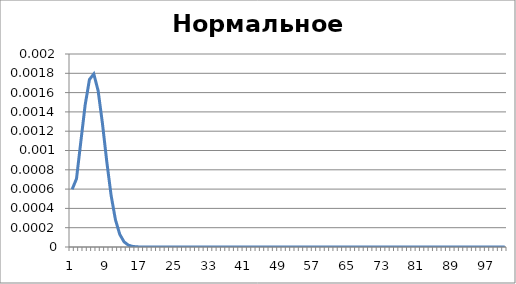
| Category | Нормальное распределение |
|---|---|
| 0 | 0.001 |
| 1 | 0.001 |
| 2 | 0.001 |
| 3 | 0.001 |
| 4 | 0.002 |
| 5 | 0.002 |
| 6 | 0.002 |
| 7 | 0.001 |
| 8 | 0.001 |
| 9 | 0.001 |
| 10 | 0 |
| 11 | 0 |
| 12 | 0 |
| 13 | 0 |
| 14 | 0 |
| 15 | 0 |
| 16 | 0 |
| 17 | 0 |
| 18 | 0 |
| 19 | 0 |
| 20 | 0 |
| 21 | 0 |
| 22 | 0 |
| 23 | 0 |
| 24 | 0 |
| 25 | 0 |
| 26 | 0 |
| 27 | 0 |
| 28 | 0 |
| 29 | 0 |
| 30 | 0 |
| 31 | 0 |
| 32 | 0 |
| 33 | 0 |
| 34 | 0 |
| 35 | 0 |
| 36 | 0 |
| 37 | 0 |
| 38 | 0 |
| 39 | 0 |
| 40 | 0 |
| 41 | 0 |
| 42 | 0 |
| 43 | 0 |
| 44 | 0 |
| 45 | 0 |
| 46 | 0 |
| 47 | 0 |
| 48 | 0 |
| 49 | 0 |
| 50 | 0 |
| 51 | 0 |
| 52 | 0 |
| 53 | 0 |
| 54 | 0 |
| 55 | 0 |
| 56 | 0 |
| 57 | 0 |
| 58 | 0 |
| 59 | 0 |
| 60 | 0 |
| 61 | 0 |
| 62 | 0 |
| 63 | 0 |
| 64 | 0 |
| 65 | 0 |
| 66 | 0 |
| 67 | 0 |
| 68 | 0 |
| 69 | 0 |
| 70 | 0 |
| 71 | 0 |
| 72 | 0 |
| 73 | 0 |
| 74 | 0 |
| 75 | 0 |
| 76 | 0 |
| 77 | 0 |
| 78 | 0 |
| 79 | 0 |
| 80 | 0 |
| 81 | 0 |
| 82 | 0 |
| 83 | 0 |
| 84 | 0 |
| 85 | 0 |
| 86 | 0 |
| 87 | 0 |
| 88 | 0 |
| 89 | 0 |
| 90 | 0 |
| 91 | 0 |
| 92 | 0 |
| 93 | 0 |
| 94 | 0 |
| 95 | 0 |
| 96 | 0 |
| 97 | 0 |
| 98 | 0 |
| 99 | 0 |
| 100 | 0 |